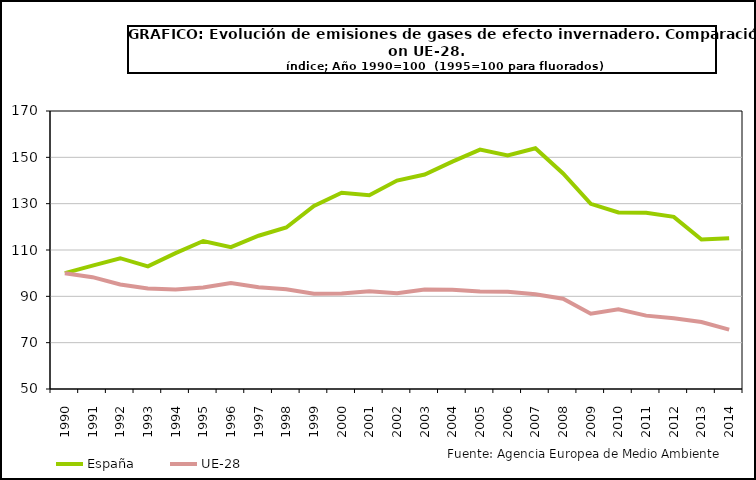
| Category | España | UE-28 |
|---|---|---|
| 1990.0 | 100 | 100 |
| 1991.0 | 103.231 | 98.263 |
| 1992.0 | 106.458 | 95.091 |
| 1993.0 | 102.912 | 93.343 |
| 1994.0 | 108.623 | 92.904 |
| 1995.0 | 113.894 | 93.805 |
| 1996.0 | 111.247 | 95.7 |
| 1997.0 | 116.161 | 93.937 |
| 1998.0 | 119.701 | 93.094 |
| 1999.0 | 129.026 | 91.107 |
| 2000.0 | 134.688 | 91.252 |
| 2001.0 | 133.668 | 92.155 |
| 2002.0 | 139.977 | 91.382 |
| 2003.0 | 142.579 | 92.916 |
| 2004.0 | 148.123 | 92.833 |
| 2005.0 | 153.348 | 92.127 |
| 2006.0 | 150.83 | 91.93 |
| 2007.0 | 153.912 | 90.888 |
| 2008.0 | 143.034 | 88.95 |
| 2009.0 | 129.924 | 82.53 |
| 2010.0 | 126.183 | 84.425 |
| 2011.0 | 126.027 | 81.674 |
| 2012.0 | 124.298 | 80.507 |
| 2013.0 | 114.519 | 78.902 |
| 2014.0 | 115.036 | 75.631 |